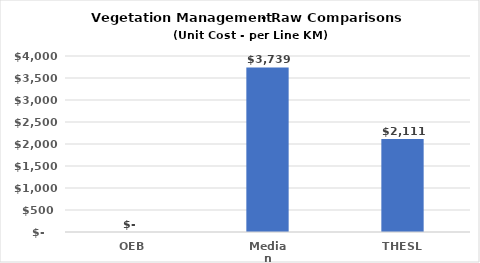
| Category | Series 0 |
|---|---|
| OEB | 0 |
| Median | 3739.167 |
| THESL | 2111 |